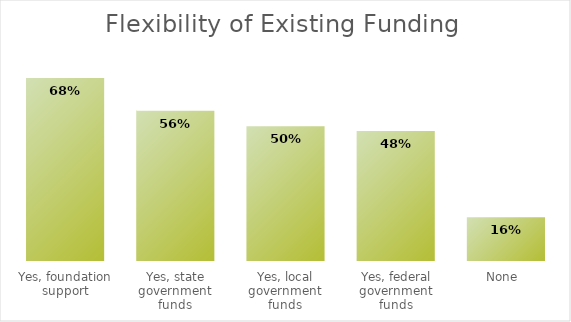
| Category | Total replies | % Total replies | %  total survey respondents |
|---|---|---|---|
| Yes, foundation support |  |  | 0.681 |
| Yes, state government funds |  |  | 0.559 |
| Yes, local government funds |  |  | 0.501 |
| Yes, federal government funds |  |  | 0.484 |
| None  |  |  | 0.163 |